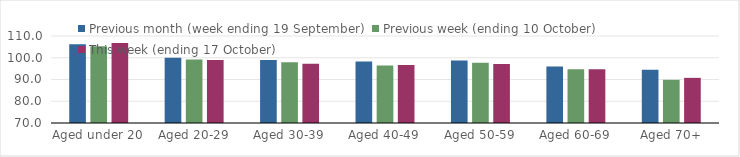
| Category | Previous month (week ending 19 September) | Previous week (ending 10 October) | This week (ending 17 October) |
|---|---|---|---|
| Aged under 20 | 106.16 | 105.23 | 106.78 |
| Aged 20-29 | 100.05 | 99.16 | 99.01 |
| Aged 30-39 | 98.91 | 97.98 | 97.21 |
| Aged 40-49 | 98.23 | 96.49 | 96.63 |
| Aged 50-59 | 98.7 | 97.65 | 97.13 |
| Aged 60-69 | 95.92 | 94.67 | 94.66 |
| Aged 70+ | 94.54 | 89.86 | 90.76 |